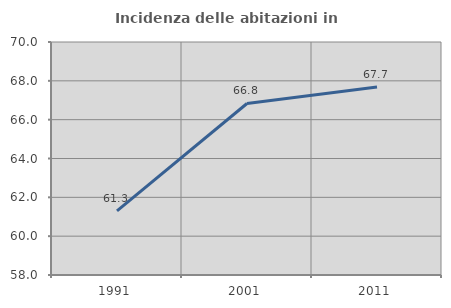
| Category | Incidenza delle abitazioni in proprietà  |
|---|---|
| 1991.0 | 61.302 |
| 2001.0 | 66.834 |
| 2011.0 | 67.679 |